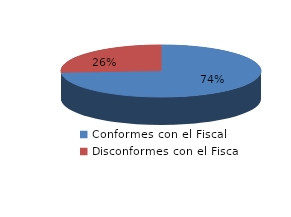
| Category | Series 0 |
|---|---|
| 0 | 5188 |
| 1 | 1833 |